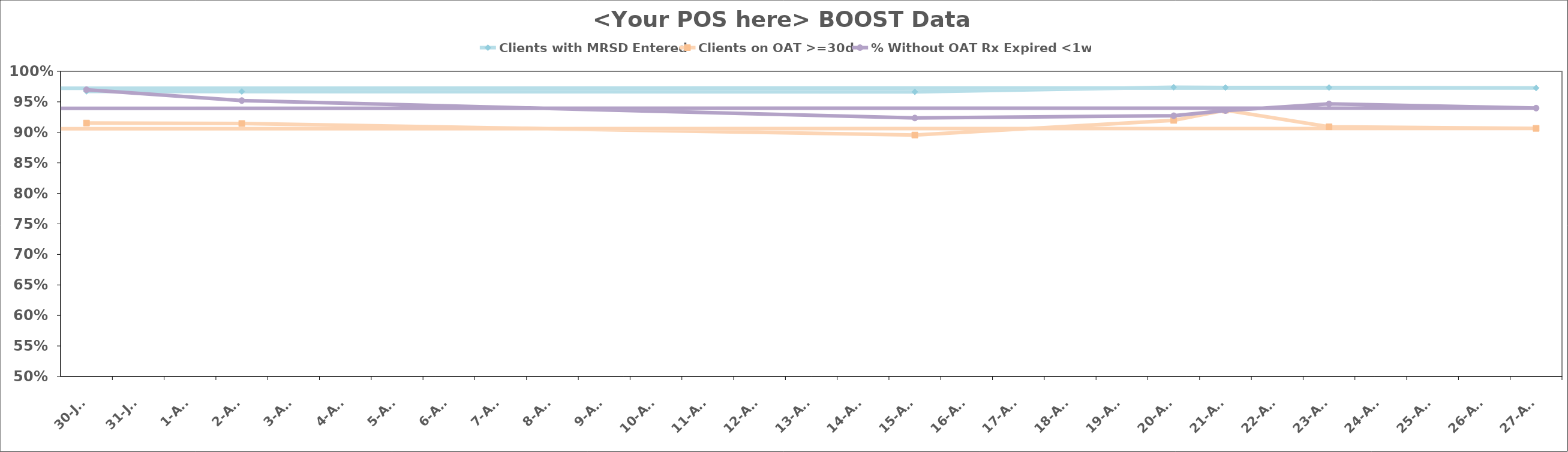
| Category | Clients with MRSD Entered | Clients on OAT >=30d | % Without OAT Rx Expired <1wk |
|---|---|---|---|
| 2018-07-30 | 0.967 | 0.915 | 0.97 |
| 2018-08-02 | 0.967 | 0.915 | 0.952 |
| 2018-08-15 | 0.966 | 0.896 | 0.924 |
| 2018-08-20 | 0.974 | 0.92 | 0.927 |
| 2018-08-21 | 0.973 | 0.936 | 0.936 |
| 2018-08-23 | 0.973 | 0.909 | 0.947 |
| 2018-08-27 | 0.973 | 0.907 | 0.94 |
| nan | 0 | 0 | 0 |
| nan | 0 | 0 | 0 |
| nan | 0 | 0 | 0 |
| nan | 0 | 0 | 0 |
| nan | 0 | 0 | 0 |
| nan | 0 | 0 | 0 |
| nan | 0 | 0 | 0 |
| nan | 0 | 0 | 0 |
| nan | 0 | 0 | 0 |
| nan | 0 | 0 | 0 |
| nan | 0 | 0 | 0 |
| nan | 0 | 0 | 0 |
| nan | 0 | 0 | 0 |
| nan | 0 | 0 | 0 |
| nan | 0 | 0 | 0 |
| nan | 0 | 0 | 0 |
| nan | 0 | 0 | 0 |
| nan | 0 | 0 | 0 |
| nan | 0 | 0 | 0 |
| nan | 0 | 0 | 0 |
| nan | 0 | 0 | 0 |
| nan | 0 | 0 | 0 |
| nan | 0 | 0 | 0 |
| nan | 0 | 0 | 0 |
| nan | 0 | 0 | 0 |
| nan | 0 | 0 | 0 |